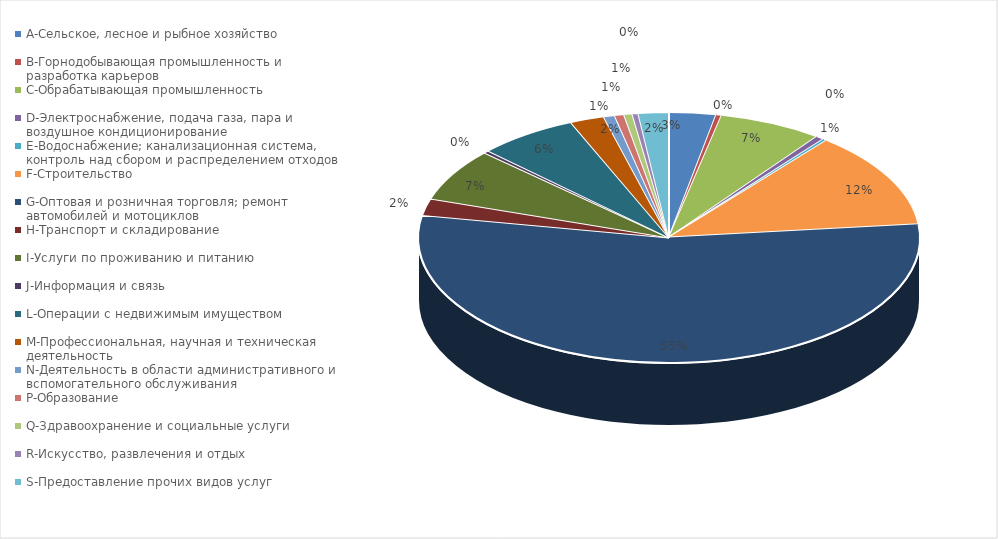
| Category | Series 0 |
|---|---|
| A-Сельское, лесное и рыбное хозяйство | 0.03 |
| B-Горнодобывающая промышленность и разработка карьеров | 0.004 |
| C-Обрабатывающая промышленность | 0.067 |
| D-Электроснабжение, подача газа, пара и воздушное кондиционирование | 0.005 |
| E-Водоснабжение; канализационная система, контроль над сбором и распределением отходов | 0.003 |
| F-Строительство | 0.125 |
| G-Оптовая и розничная торговля; ремонт автомобилей и мотоциклов | 0.545 |
| H-Транспорт и складирование | 0.022 |
| I-Услуги по проживанию и питанию | 0.068 |
| J-Информация и связь | 0.003 |
| L-Операции с недвижимым имуществом | 0.064 |
| M-Профессиональная, научная и техническая деятельность | 0.022 |
| N-Деятельность в области административного и вспомогательного обслуживания | 0.007 |
| P-Образование | 0.006 |
| Q-Здравоохранение и социальные услуги | 0.005 |
| R-Искусство, развлечения и отдых | 0.004 |
| S-Предоставление прочих видов услуг | 0.02 |